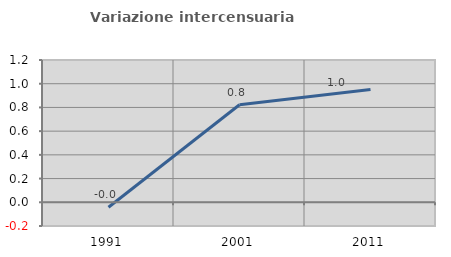
| Category | Variazione intercensuaria annua |
|---|---|
| 1991.0 | -0.042 |
| 2001.0 | 0.822 |
| 2011.0 | 0.951 |